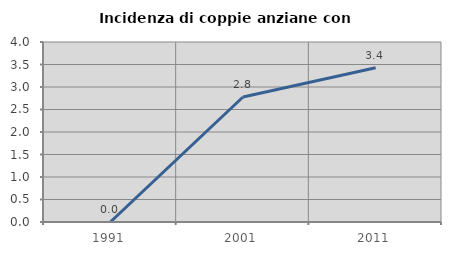
| Category | Incidenza di coppie anziane con figli |
|---|---|
| 1991.0 | 0 |
| 2001.0 | 2.778 |
| 2011.0 | 3.429 |